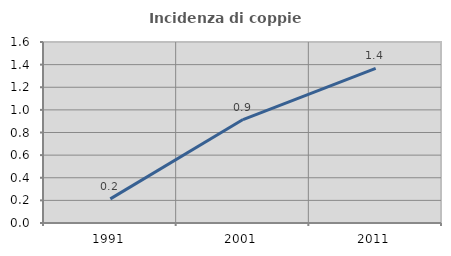
| Category | Incidenza di coppie miste |
|---|---|
| 1991.0 | 0.213 |
| 2001.0 | 0.914 |
| 2011.0 | 1.368 |